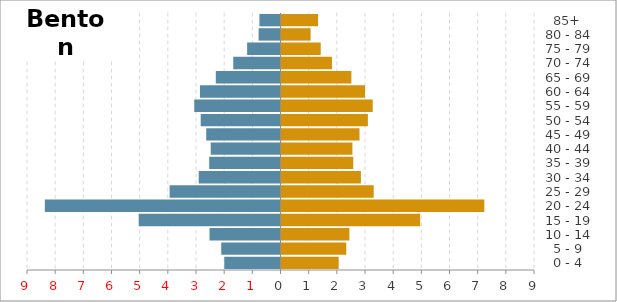
| Category | Male | Female |
|---|---|---|
|   0 - 4 | -1.996 | 2.03 |
|   5 - 9 | -2.104 | 2.299 |
| 10 - 14 | -2.52 | 2.41 |
| 15 - 19 | -5.035 | 4.923 |
| 20 - 24 | -8.367 | 7.202 |
| 25 - 29 | -3.936 | 3.273 |
| 30 - 34 | -2.904 | 2.818 |
| 35 - 39 | -2.532 | 2.547 |
| 40 - 44 | -2.477 | 2.517 |
| 45 - 49 | -2.637 | 2.769 |
| 50 - 54 | -2.833 | 3.067 |
| 55 - 59 | -3.061 | 3.239 |
| 60 - 64 | -2.86 | 2.966 |
| 65 - 69 | -2.297 | 2.48 |
| 70 - 74 | -1.677 | 1.791 |
| 75 - 79 | -1.185 | 1.392 |
| 80 - 84 | -0.777 | 1.034 |
|   85+ | -0.748 | 1.298 |